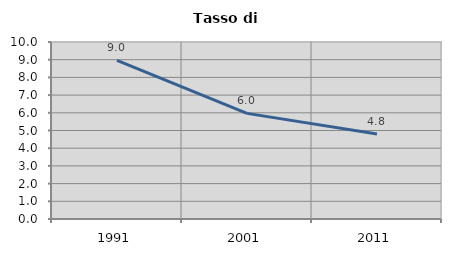
| Category | Tasso di disoccupazione   |
|---|---|
| 1991.0 | 8.956 |
| 2001.0 | 5.967 |
| 2011.0 | 4.797 |